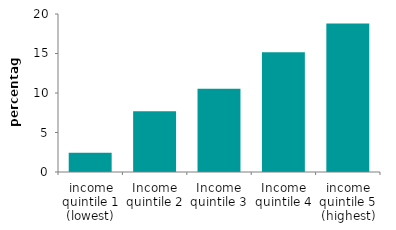
| Category | Series 0 |
|---|---|
| income quintile 1 (lowest) | 2.427 |
| Income quintile 2 | 7.693 |
| Income quintile 3 | 10.522 |
| Income quintile 4 | 15.156 |
| income quintile 5 (highest) | 18.786 |